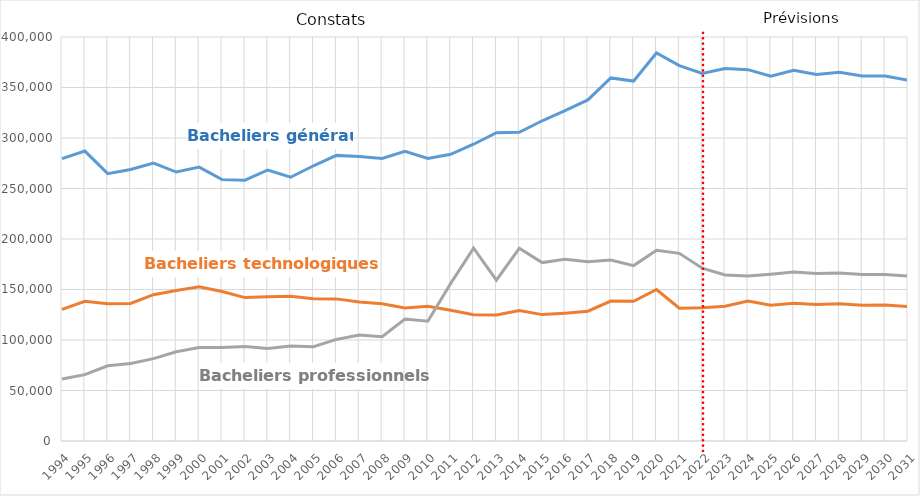
| Category | Bacheliers généraux | Bacheliers technologiques | Bacheliers professionnels |
|---|---|---|---|
| 1994.0 | 279586 | 130282 | 61465 |
| 1995.0 | 287046 | 138267 | 65741 |
| 1996.0 | 264727 | 135882 | 74514 |
| 1997.0 | 268868 | 136204 | 76726 |
| 1998.0 | 275113 | 144830 | 81573 |
| 1999.0 | 266285 | 149103 | 88296 |
| 2000.0 | 271155 | 152778 | 92617 |
| 2001.0 | 258785 | 147944 | 92499 |
| 2002.0 | 258192 | 141983 | 93580 |
| 2003.0 | 268335 | 142799 | 91537 |
| 2004.0 | 261137 | 143277 | 93958 |
| 2005.0 | 272512 | 140828 | 93268 |
| 2006.0 | 282788 | 140707 | 100562 |
| 2007.0 | 281733 | 137605 | 104975 |
| 2008.0 | 279698 | 135886 | 103311 |
| 2009.0 | 286762 | 131602 | 120728 |
| 2010.0 | 279798 | 133431 | 118593 |
| 2011.0 | 283821 | 129472 | 156063 |
| 2012.0 | 293837 | 125121 | 190899 |
| 2013.0 | 305316 | 124853 | 159241 |
| 2014.0 | 305667 | 129210 | 190773 |
| 2015.0 | 317054 | 125144 | 176646 |
| 2016.0 | 327078 | 126578 | 179841 |
| 2017.0 | 337714 | 128488 | 177570 |
| 2018.0 | 359455 | 138570 | 179262 |
| 2019.0 | 356384 | 138284 | 173675 |
| 2020.0 | 384158 | 149972 | 188841 |
| 2021.0 | 371705 | 131506 | 185810 |
| 2022.0 | 363861 | 131896 | 171050 |
| 2023.0 | 368749 | 133386 | 164469 |
| 2024.0 | 367680 | 138569 | 163314 |
| 2025.0 | 361248 | 134419 | 165172 |
| 2026.0 | 367008 | 136426 | 167442 |
| 2027.0 | 362784 | 135074 | 165791 |
| 2028.0 | 365088 | 135776 | 166410 |
| 2029.0 | 361440 | 134515 | 164965 |
| 2030.0 | 361344 | 134562 | 164862 |
| 2031.0 | 357216 | 133096 | 163211 |